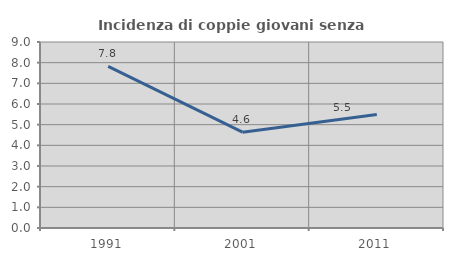
| Category | Incidenza di coppie giovani senza figli |
|---|---|
| 1991.0 | 7.825 |
| 2001.0 | 4.637 |
| 2011.0 | 5.487 |